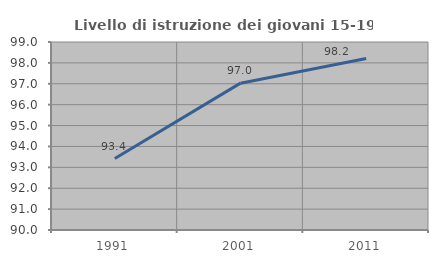
| Category | Livello di istruzione dei giovani 15-19 anni |
|---|---|
| 1991.0 | 93.421 |
| 2001.0 | 97.03 |
| 2011.0 | 98.214 |